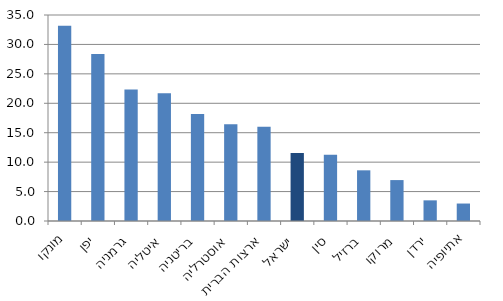
| Category | Series 0 |
|---|---|
| מונקו | 33.153 |
| יפן | 28.377 |
| גרמניה | 22.362 |
| איטליה | 21.69 |
| בריטניה | 18.186 |
| אוסטרליה | 16.439 |
| ארצות הברית | 16.026 |
| ישראל | 11.552 |
| סין | 11.274 |
| ברזיל | 8.61 |
| מרוקו | 6.951 |
| ירדן | 3.509 |
| אתיופיה | 2.967 |